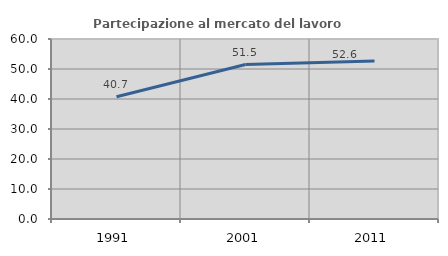
| Category | Partecipazione al mercato del lavoro  femminile |
|---|---|
| 1991.0 | 40.741 |
| 2001.0 | 51.485 |
| 2011.0 | 52.632 |